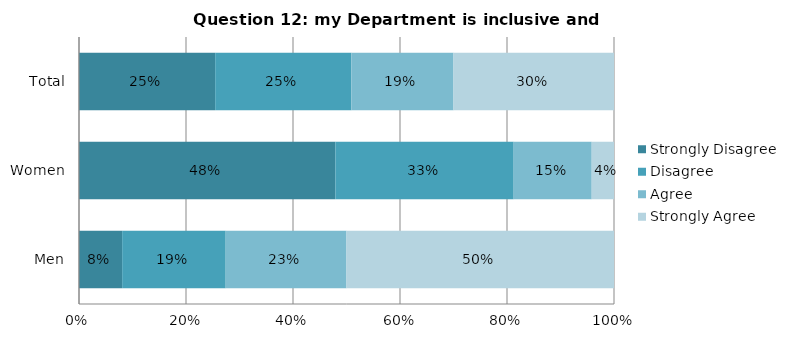
| Category | Strongly Disagree | Disagree | Agree | Strongly Agree |
|---|---|---|---|---|
| Men | 0.081 | 0.194 | 0.226 | 0.5 |
| Women | 0.479 | 0.333 | 0.146 | 0.042 |
| Total | 0.255 | 0.255 | 0.191 | 0.3 |